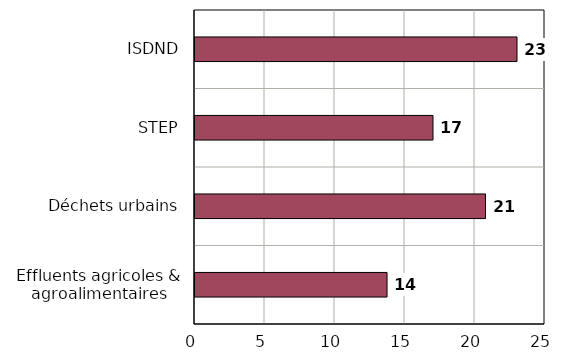
| Category | Capacité moyenne par projet |
|---|---|
| Effluents agricoles & agroalimentaires | 13.717 |
| Déchets urbains | 20.75 |
| STEP | 17 |
| ISDND | 23 |